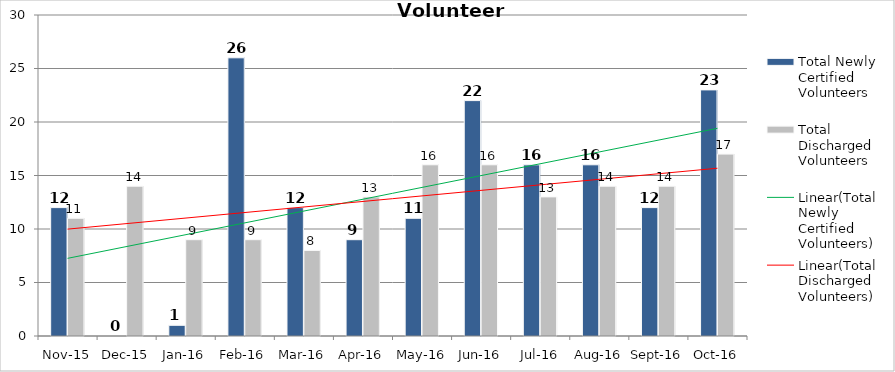
| Category | Total Newly Certified Volunteers | Total Discharged Volunteers |
|---|---|---|
| Nov-15 | 12 | 11 |
| Dec-15 | 0 | 14 |
| Jan-16 | 1 | 9 |
| Feb-16 | 26 | 9 |
| Mar-16 | 12 | 8 |
| Apr-16 | 9 | 13 |
| May-16 | 11 | 16 |
| Jun-16 | 22 | 16 |
| Jul-16 | 16 | 13 |
| Aug-16 | 16 | 14 |
| Sep-16 | 12 | 14 |
| Oct-16 | 23 | 17 |